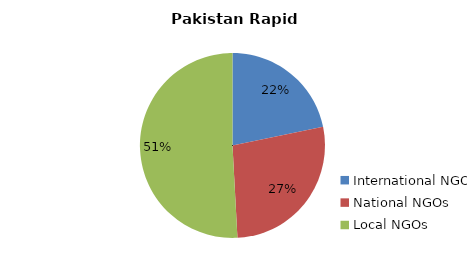
| Category | Series 0 |
|---|---|
| International NGOs  | 0.218 |
| National NGOs | 0.274 |
| Local NGOs  | 0.509 |